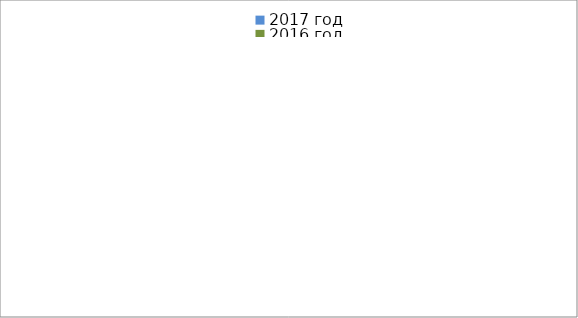
| Category | 2017 год | 2016 год |
|---|---|---|
|  - поджог | 19 | 41 |
|  - неосторожное обращение с огнём | 7 | 22 |
|  - НПТЭ электрооборудования | 26 | 22 |
|  - НПУ и Э печей | 48 | 34 |
|  - НПУ и Э транспортных средств | 45 | 34 |
|   -Шалость с огнем детей | 4 | 6 |
|  -НППБ при эксплуатации эл.приборов | 24 | 17 |
|  - курение | 37 | 31 |
| - прочие | 76 | 99 |
| - не установленные причины | 0 | 12 |